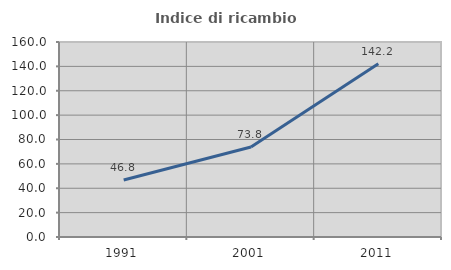
| Category | Indice di ricambio occupazionale  |
|---|---|
| 1991.0 | 46.797 |
| 2001.0 | 73.79 |
| 2011.0 | 142.237 |